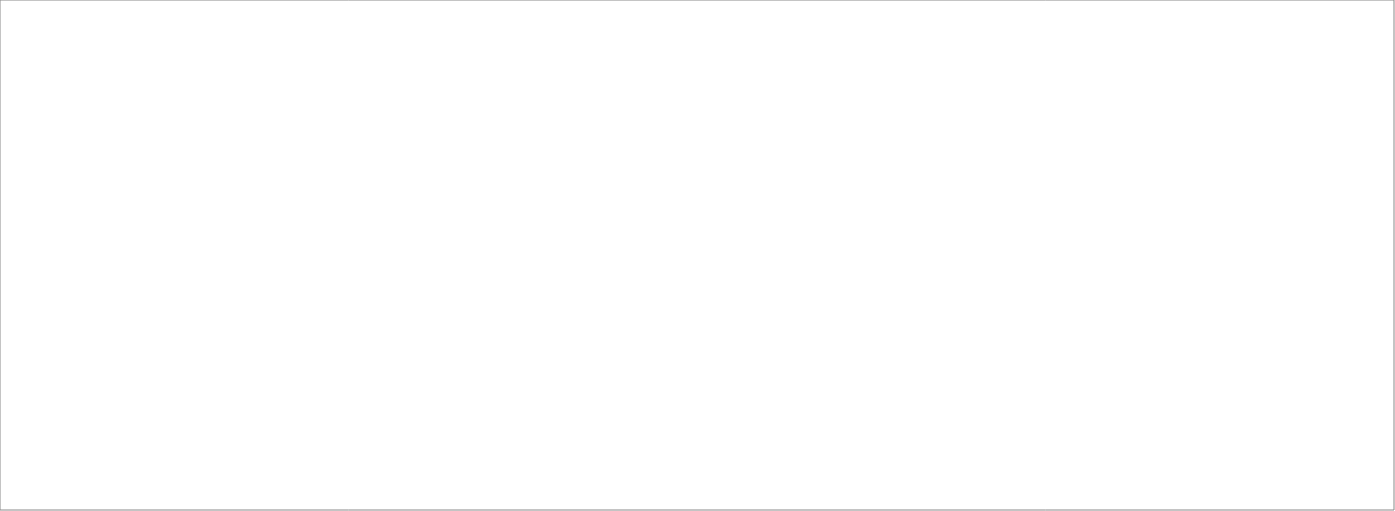
| Category | Cultivo de café | Cultivo de banano | Cultivo de cardamomo | Cultivo de cereales | Cultivo de tubérculos, raíces, hortalizas y legumbres | Cultivo de frutas y nueces | Otros cultivos agrícolas | Ganadería | Silvicultura y pesca |
|---|---|---|---|---|---|---|---|---|---|
| 2018_I | 945.083 | 1531.846 | 85.531 | 168.636 | 2642.189 | 2648.173 | 1487.695 | 3179.067 | 832.008 |
| 2018_II | 603.964 | 1380.329 | 765.724 | 545.211 | 3073.803 | 1109.635 | 1556.055 | 2958.372 | 1105.775 |
| 2018_III | 950.9 | 1627.757 | 574.107 | 1075.608 | 3193.663 | 1010.874 | 1283.813 | 2843.878 | 1054.323 |
| 2018_IV | 1580.351 | 1696.388 | 1513.635 | 1375.892 | 6395.794 | 1921.445 | 915.971 | 2816.255 | 410.711 |
| 2019_I | 1066.103 | 1638.824 | 128.195 | 210.555 | 2841.211 | 2346.725 | 1585.535 | 3229.518 | 843.228 |
| 2019_II | 679.651 | 1495.478 | 1192.874 | 627.807 | 3369.054 | 1119.249 | 1549.118 | 2969.217 | 1089.325 |
| 2019_III | 0 | 0 | 0 | 0 | 0 | 0 | 0 | 0 | 0 |
| 2019_IV | 0 | 0 | 0 | 0 | 0 | 0 | 0 | 0 | 0 |